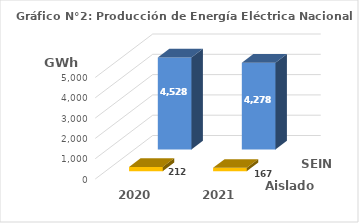
| Category | Aislados | SEIN |
|---|---|---|
| 2020.0 | 212.49 | 4527.978 |
| 2021.0 | 166.88 | 4277.672 |